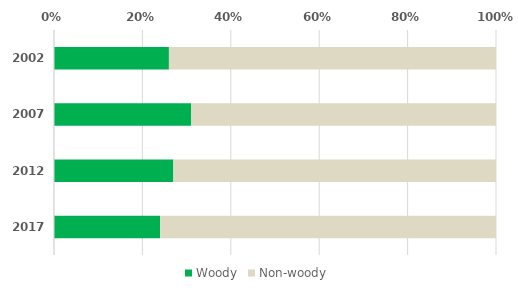
| Category | Woody | Non-woody |
|---|---|---|
| 2002.0 | 26 | 74 |
| 2007.0 | 31 | 69 |
| 2012.0 | 27 | 73 |
| 2017.0 | 24 | 76 |